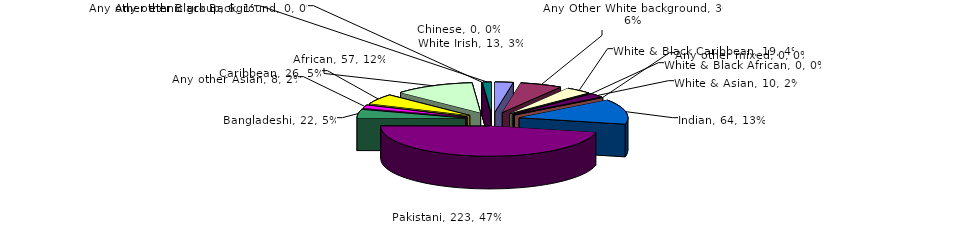
| Category | Series 0 |
|---|---|
| White Irish | 13 |
| Any Other White background | 30 |
| White & Black Caribbean | 19 |
| White & Black African | 0 |
| White & Asian | 10 |
| Any other mixed | 0 |
| Indian | 64 |
| Pakistani | 223 |
| Bangladeshi | 22 |
| Any other Asian | 8 |
| Caribbean | 26 |
| African | 57 |
| Any other Black Background | 0 |
| Chinese | 0 |
| Any other ethnic group | 6 |